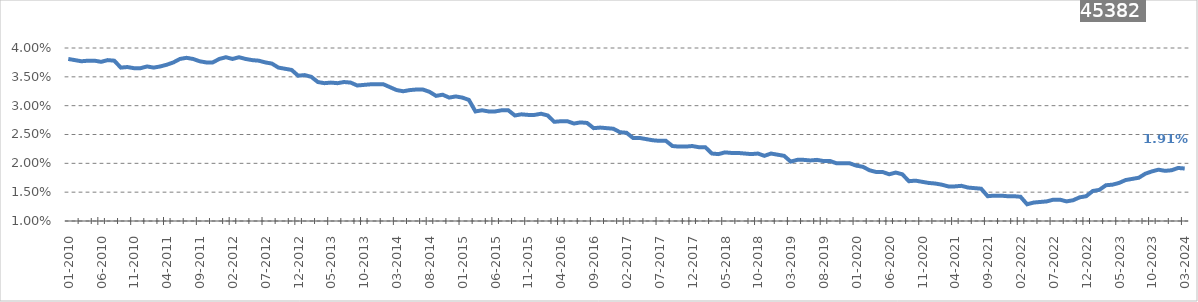
| Category | Implicit yield |
|---|---|
| 2010-01-01 | 0.038 |
| 2010-02-01 | 0.038 |
| 2010-03-01 | 0.038 |
| 2010-04-01 | 0.038 |
| 2010-05-01 | 0.038 |
| 2010-06-01 | 0.038 |
| 2010-07-01 | 0.038 |
| 2010-08-01 | 0.038 |
| 2010-09-01 | 0.037 |
| 2010-10-01 | 0.037 |
| 2010-11-01 | 0.036 |
| 2010-12-01 | 0.036 |
| 2011-01-01 | 0.037 |
| 2011-02-01 | 0.037 |
| 2011-03-01 | 0.037 |
| 2011-04-01 | 0.037 |
| 2011-05-01 | 0.038 |
| 2011-06-01 | 0.038 |
| 2011-07-01 | 0.038 |
| 2011-08-01 | 0.038 |
| 2011-09-01 | 0.038 |
| 2011-10-01 | 0.038 |
| 2011-11-01 | 0.038 |
| 2011-12-01 | 0.038 |
| 2012-01-01 | 0.038 |
| 2012-02-01 | 0.038 |
| 2012-03-01 | 0.038 |
| 2012-04-01 | 0.038 |
| 2012-05-01 | 0.038 |
| 2012-06-01 | 0.038 |
| 2012-07-01 | 0.038 |
| 2012-08-01 | 0.037 |
| 2012-09-01 | 0.037 |
| 2012-10-01 | 0.036 |
| 2012-11-01 | 0.036 |
| 2012-12-01 | 0.035 |
| 2013-01-01 | 0.035 |
| 2013-02-01 | 0.035 |
| 2013-03-01 | 0.034 |
| 2013-04-01 | 0.034 |
| 2013-05-01 | 0.034 |
| 2013-06-01 | 0.034 |
| 2013-07-01 | 0.034 |
| 2013-08-01 | 0.034 |
| 2013-09-01 | 0.034 |
| 2013-10-01 | 0.034 |
| 2013-11-01 | 0.034 |
| 2013-12-01 | 0.034 |
| 2014-01-01 | 0.034 |
| 2014-02-01 | 0.033 |
| 2014-03-01 | 0.033 |
| 2014-04-01 | 0.032 |
| 2014-05-01 | 0.033 |
| 2014-06-01 | 0.033 |
| 2014-07-01 | 0.033 |
| 2014-08-01 | 0.032 |
| 2014-09-01 | 0.032 |
| 2014-10-01 | 0.032 |
| 2014-11-01 | 0.031 |
| 2014-12-01 | 0.032 |
| 2015-01-01 | 0.031 |
| 2015-02-01 | 0.031 |
| 2015-03-01 | 0.029 |
| 2015-04-01 | 0.029 |
| 2015-05-01 | 0.029 |
| 2015-06-01 | 0.029 |
| 2015-07-01 | 0.029 |
| 2015-08-01 | 0.029 |
| 2015-09-01 | 0.028 |
| 2015-10-01 | 0.028 |
| 2015-11-01 | 0.028 |
| 2015-12-01 | 0.028 |
| 2016-01-01 | 0.029 |
| 2016-02-01 | 0.028 |
| 2016-03-01 | 0.027 |
| 2016-04-01 | 0.027 |
| 2016-05-01 | 0.027 |
| 2016-06-01 | 0.027 |
| 2016-07-01 | 0.027 |
| 2016-08-01 | 0.027 |
| 2016-09-01 | 0.026 |
| 2016-10-01 | 0.026 |
| 2016-11-01 | 0.026 |
| 2016-12-01 | 0.026 |
| 2017-01-01 | 0.025 |
| 2017-02-01 | 0.025 |
| 2017-03-01 | 0.024 |
| 2017-04-01 | 0.024 |
| 2017-05-01 | 0.024 |
| 2017-06-01 | 0.024 |
| 2017-07-01 | 0.024 |
| 2017-08-01 | 0.024 |
| 2017-09-01 | 0.023 |
| 2017-10-01 | 0.023 |
| 2017-11-01 | 0.023 |
| 2017-12-01 | 0.023 |
| 2018-01-01 | 0.023 |
| 2018-02-01 | 0.023 |
| 2018-03-01 | 0.022 |
| 2018-04-01 | 0.022 |
| 2018-05-01 | 0.022 |
| 2018-06-01 | 0.022 |
| 2018-07-01 | 0.022 |
| 2018-08-01 | 0.022 |
| 2018-09-01 | 0.022 |
| 2018-10-01 | 0.022 |
| 2018-11-01 | 0.021 |
| 2018-12-01 | 0.022 |
| 2019-01-01 | 0.022 |
| 2019-02-01 | 0.021 |
| 2019-03-01 | 0.02 |
| 2019-04-01 | 0.021 |
| 2019-05-01 | 0.021 |
| 2019-06-01 | 0.02 |
| 2019-07-01 | 0.021 |
| 2019-08-01 | 0.02 |
| 2019-09-01 | 0.02 |
| 2019-10-01 | 0.02 |
| 2019-11-01 | 0.02 |
| 2019-12-01 | 0.02 |
| 2020-01-01 | 0.02 |
| 2020-02-01 | 0.019 |
| 2020-03-01 | 0.019 |
| 2020-04-01 | 0.018 |
| 2020-05-01 | 0.018 |
| 2020-06-01 | 0.018 |
| 2020-07-01 | 0.018 |
| 2020-08-01 | 0.018 |
| 2020-09-01 | 0.017 |
| 2020-10-01 | 0.017 |
| 2020-11-01 | 0.017 |
| 2020-12-01 | 0.017 |
| 2021-01-01 | 0.016 |
| 2021-02-01 | 0.016 |
| 2021-03-01 | 0.016 |
| 2021-04-01 | 0.016 |
| 2021-05-01 | 0.016 |
| 2021-06-01 | 0.016 |
| 2021-07-01 | 0.016 |
| 2021-08-01 | 0.016 |
| 2021-09-01 | 0.014 |
| 2021-10-01 | 0.014 |
| 2021-11-01 | 0.014 |
| 2021-12-01 | 0.014 |
| 2022-01-01 | 0.014 |
| 2022-02-01 | 0.014 |
| 2022-03-01 | 0.013 |
| 2022-04-01 | 0.013 |
| 2022-05-01 | 0.013 |
| 2022-06-01 | 0.013 |
| 2022-07-01 | 0.014 |
| 2022-08-01 | 0.014 |
| 2022-09-01 | 0.013 |
| 2022-10-01 | 0.014 |
| 2022-11-01 | 0.014 |
| 2022-12-01 | 0.014 |
| 2023-01-01 | 0.015 |
| 2023-02-01 | 0.015 |
| 2023-03-01 | 0.016 |
| 2023-04-01 | 0.016 |
| 2023-05-01 | 0.017 |
| 2023-06-01 | 0.017 |
| 2023-07-01 | 0.017 |
| 2023-08-01 | 0.018 |
| 2023-09-01 | 0.018 |
| 2023-10-01 | 0.019 |
| 2023-11-01 | 0.019 |
| 2023-12-01 | 0.019 |
| 2024-01-01 | 0.019 |
| 2024-02-01 | 0.019 |
| 2024-03-01 | 0.019 |